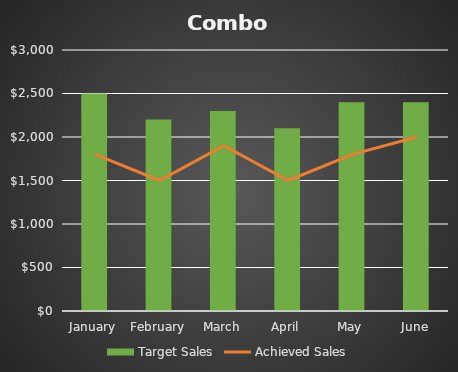
| Category | Target Sales |
|---|---|
| January | 2500 |
| February | 2200 |
| March | 2300 |
| April | 2100 |
| May | 2400 |
| June | 2400 |